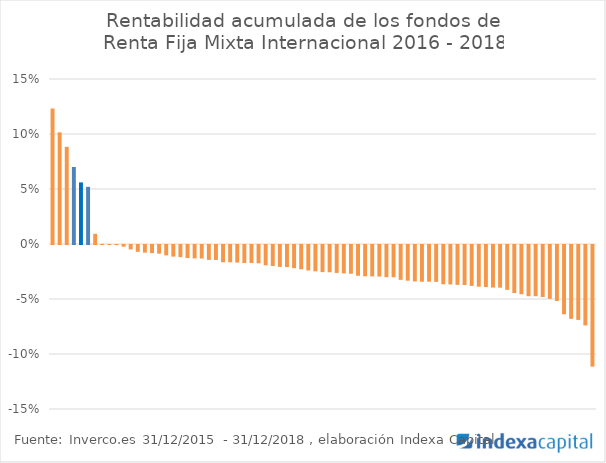
| Category | Series 0 |
|---|---|
| 0 | 0.123 |
| 1 | 0.102 |
| 2 | 0.088 |
| 3 | 0.07 |
| 4 | 0.056 |
| 5 | 0.052 |
| 6 | 0.009 |
| 7 | 0 |
| 8 | 0 |
| 9 | 0 |
| 10 | -0.002 |
| 11 | -0.004 |
| 12 | -0.006 |
| 13 | -0.007 |
| 14 | -0.007 |
| 15 | -0.008 |
| 16 | -0.009 |
| 17 | -0.011 |
| 18 | -0.011 |
| 19 | -0.012 |
| 20 | -0.012 |
| 21 | -0.012 |
| 22 | -0.014 |
| 23 | -0.014 |
| 24 | -0.016 |
| 25 | -0.016 |
| 26 | -0.016 |
| 27 | -0.016 |
| 28 | -0.016 |
| 29 | -0.017 |
| 30 | -0.018 |
| 31 | -0.019 |
| 32 | -0.02 |
| 33 | -0.02 |
| 34 | -0.021 |
| 35 | -0.022 |
| 36 | -0.023 |
| 37 | -0.024 |
| 38 | -0.025 |
| 39 | -0.025 |
| 40 | -0.025 |
| 41 | -0.026 |
| 42 | -0.026 |
| 43 | -0.028 |
| 44 | -0.028 |
| 45 | -0.029 |
| 46 | -0.029 |
| 47 | -0.029 |
| 48 | -0.029 |
| 49 | -0.032 |
| 50 | -0.032 |
| 51 | -0.033 |
| 52 | -0.033 |
| 53 | -0.033 |
| 54 | -0.034 |
| 55 | -0.036 |
| 56 | -0.036 |
| 57 | -0.036 |
| 58 | -0.036 |
| 59 | -0.037 |
| 60 | -0.038 |
| 61 | -0.038 |
| 62 | -0.039 |
| 63 | -0.039 |
| 64 | -0.041 |
| 65 | -0.044 |
| 66 | -0.045 |
| 67 | -0.047 |
| 68 | -0.047 |
| 69 | -0.047 |
| 70 | -0.049 |
| 71 | -0.051 |
| 72 | -0.063 |
| 73 | -0.067 |
| 74 | -0.068 |
| 75 | -0.073 |
| 76 | -0.111 |